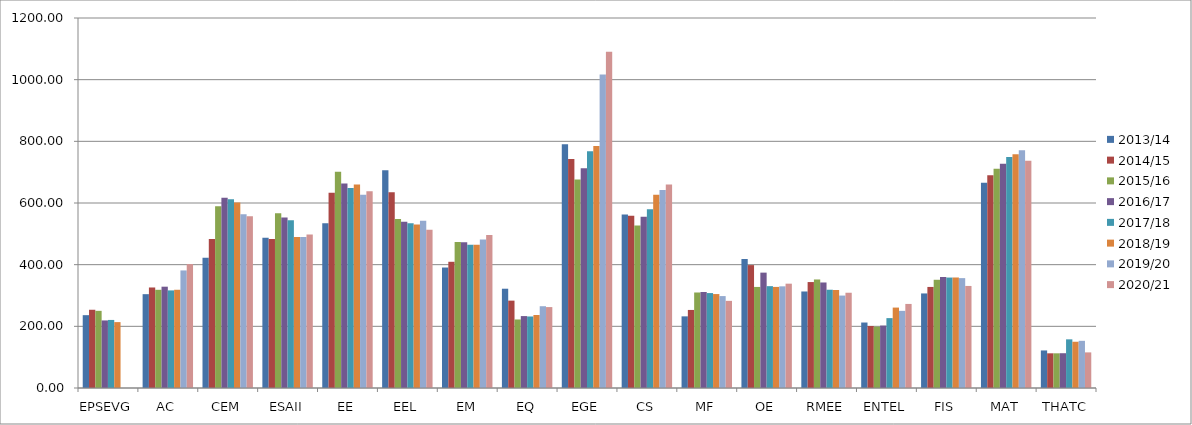
| Category | 2013/14 | 2014/15 | 2015/16 | 2016/17 | 2017/18 | 2018/19 | 2019/20 | 2020/21 |
|---|---|---|---|---|---|---|---|---|
| EPSEVG | 236.21 | 253.76 | 250.25 | 219.142 | 220.742 | 213.699 | 0 | 0 |
| AC | 304.33 | 326 | 318.5 | 328.58 | 316.55 | 318.61 | 381.28 | 401.88 |
| CEM | 422.78 | 483.14 | 589.525 | 617.17 | 612.267 | 601.49 | 563.118 | 556.74 |
| ESAII | 486.94 | 483.27 | 567 | 552.905 | 544.059 | 489.96 | 489.831 | 497.61 |
| EE | 534.44 | 633.19 | 701.6 | 663.57 | 648.45 | 660.34 | 626.371 | 638.266 |
| EEL | 705.89 | 634.64 | 548.15 | 538.866 | 534.172 | 529.952 | 542.478 | 512.895 |
| EM | 390.72 | 409.34 | 473.13 | 472.71 | 464.5 | 464.2 | 481.55 | 496.13 |
| EQ | 321.99 | 283.35 | 222.25 | 233.248 | 231.946 | 236.746 | 265.245 | 262.439 |
| EGE | 790.58 | 742.58 | 675.95 | 712.96 | 767.517 | 785.03 | 1016.44 | 1090.925 |
| CS | 562.37 | 559.01 | 526.91 | 555.16 | 579.6 | 626.94 | 641.92 | 660.06 |
| MF | 232.35 | 253.14 | 309.75 | 311.278 | 307.891 | 304.662 | 298.108 | 282.61 |
| OE | 418.04 | 398.58 | 327.765 | 374.17 | 330.3 | 327.85 | 329.7 | 338.36 |
| RMEE | 313.03 | 343.6 | 351.98 | 342.22 | 318.7 | 317.9 | 299.8 | 308.95 |
| ENTEL | 212.37 | 201.01 | 199 | 202.495 | 226.655 | 260.831 | 250.189 | 272.634 |
| FIS | 306.68 | 327.75 | 351 | 360 | 358.2 | 358.4 | 356.35 | 330.99 |
| MAT | 665.55 | 690 | 710.75 | 727.062 | 749.349 | 758.19 | 770.871 | 737.288 |
| THATC | 121.8 | 112.5 | 112.5 | 112.804 | 157.804 | 150 | 153 | 115.5 |